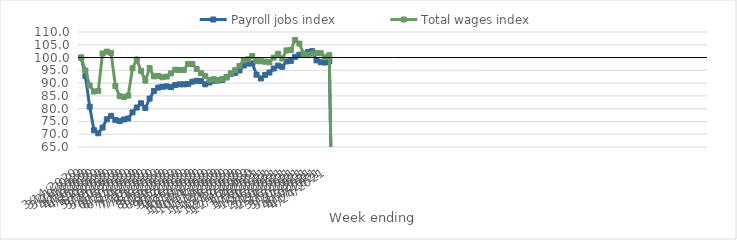
| Category | Payroll jobs index | Total wages index |
|---|---|---|
| 14/03/2020 | 100 | 100 |
| 21/03/2020 | 92.765 | 94.953 |
| 28/03/2020 | 80.739 | 89.062 |
| 04/04/2020 | 71.554 | 86.722 |
| 11/04/2020 | 70.368 | 86.897 |
| 18/04/2020 | 72.611 | 101.61 |
| 25/04/2020 | 75.856 | 102.315 |
| 02/05/2020 | 77.182 | 101.827 |
| 09/05/2020 | 75.597 | 88.877 |
| 16/05/2020 | 75.131 | 84.896 |
| 23/05/2020 | 75.767 | 84.537 |
| 30/05/2020 | 76.158 | 85.109 |
| 06/06/2020 | 78.549 | 95.814 |
| 13/06/2020 | 80.461 | 99.204 |
| 20/06/2020 | 82.124 | 94.8 |
| 27/06/2020 | 80.276 | 90.987 |
| 04/07/2020 | 83.931 | 95.842 |
| 11/07/2020 | 86.873 | 92.636 |
| 18/07/2020 | 88.245 | 92.83 |
| 25/07/2020 | 88.571 | 92.289 |
| 01/08/2020 | 88.734 | 92.556 |
| 08/08/2020 | 88.44 | 93.809 |
| 15/08/2020 | 89.264 | 95.244 |
| 22/08/2020 | 89.509 | 95.146 |
| 29/08/2020 | 89.519 | 95.166 |
| 05/09/2020 | 89.612 | 97.52 |
| 12/09/2020 | 90.552 | 97.472 |
| 19/09/2020 | 90.898 | 95.52 |
| 26/09/2020 | 90.814 | 93.867 |
| 03/10/2020 | 89.546 | 92.778 |
| 10/10/2020 | 90.232 | 91.265 |
| 17/10/2020 | 90.926 | 91.558 |
| 24/10/2020 | 91.081 | 90.948 |
| 31/10/2020 | 91.228 | 91.632 |
| 07/11/2020 | 92.363 | 92.198 |
| 14/11/2020 | 93.591 | 93.844 |
| 21/11/2020 | 94.011 | 95.069 |
| 28/11/2020 | 94.938 | 96.706 |
| 05/12/2020 | 96.887 | 98.836 |
| 12/12/2020 | 97.641 | 99.309 |
| 19/12/2020 | 97.741 | 100.59 |
| 26/12/2020 | 93.303 | 98.584 |
| 02/01/2021 | 91.818 | 98.565 |
| 09/01/2021 | 93.199 | 98.386 |
| 16/01/2021 | 94.142 | 98.142 |
| 23/01/2021 | 95.716 | 99.979 |
| 30/01/2021 | 96.851 | 101.479 |
| 06/02/2021 | 96.382 | 99.641 |
| 13/02/2021 | 98.477 | 102.803 |
| 20/02/2021 | 98.7 | 102.953 |
| 27/02/2021 | 100.295 | 106.894 |
| 06/03/2021 | 101.137 | 105.463 |
| 13/03/2021 | 101.504 | 101.463 |
| 20/03/2021 | 102.183 | 101.091 |
| 27/03/2021 | 102.513 | 101.556 |
| 03/04/2021 | 98.905 | 101.774 |
| 10/04/2021 | 98.178 | 101.7 |
| 17/04/2021 | 98.051 | 100.112 |
| 24/04/2021 | 98.539 | 100.927 |